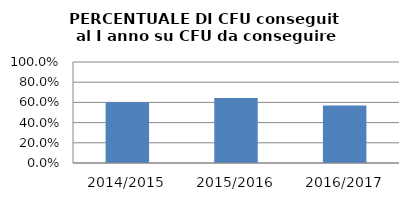
| Category | 2014/2015 2015/2016 2016/2017 |
|---|---|
| 2014/2015 | 0.601 |
| 2015/2016 | 0.645 |
| 2016/2017 | 0.569 |